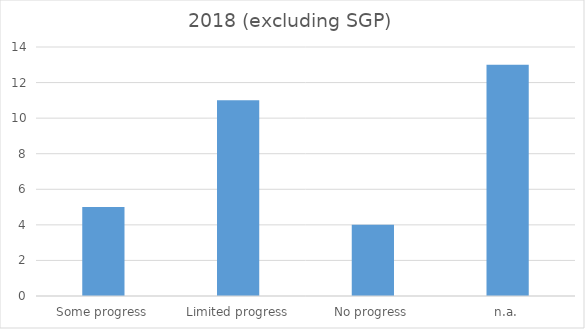
| Category | Total |
|---|---|
| Some progress | 5 |
| Limited progress | 11 |
| No progress | 4 |
| n.a. | 13 |